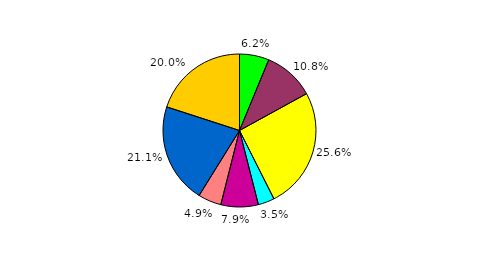
| Category | Series 0 |
|---|---|
| 0 | 6.239 |
| 1 | 10.773 |
| 2 | 25.561 |
| 3 | 3.454 |
| 4 | 7.902 |
| 5 | 4.922 |
| 6 | 21.136 |
| 7 | 20.013 |